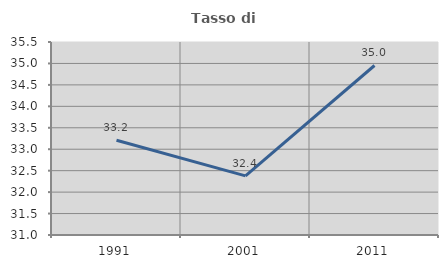
| Category | Tasso di occupazione   |
|---|---|
| 1991.0 | 33.211 |
| 2001.0 | 32.378 |
| 2011.0 | 34.952 |